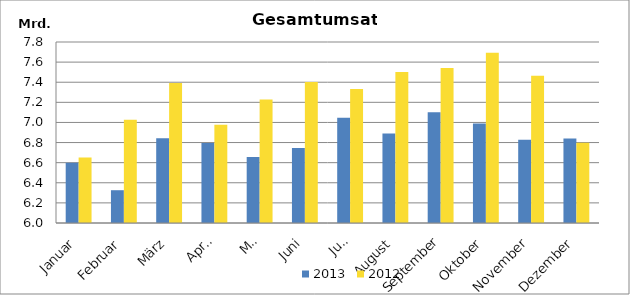
| Category | 2013 | 2012 |
|---|---|---|
| Januar | 6598983.399 | 6651220.609 |
| Februar | 6326056.733 | 7027467.265 |
| März | 6842406.344 | 7393407.999 |
| April | 6794910.159 | 6975907.708 |
| Mai | 6656393.27 | 7228895.736 |
| Juni | 6746777.227 | 7401390.317 |
| Juli | 7047085.224 | 7332976.454 |
| August | 6891157.753 | 7502875.479 |
| September | 7100327.321 | 7540452.842 |
| Oktober | 6990482.264 | 7693475.608 |
| November | 6828926.216 | 7463607.446 |
| Dezember | 6840593.395 | 6799177.515 |